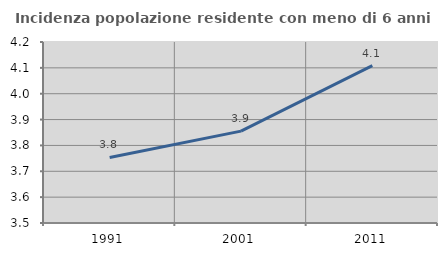
| Category | Incidenza popolazione residente con meno di 6 anni |
|---|---|
| 1991.0 | 3.754 |
| 2001.0 | 3.855 |
| 2011.0 | 4.108 |